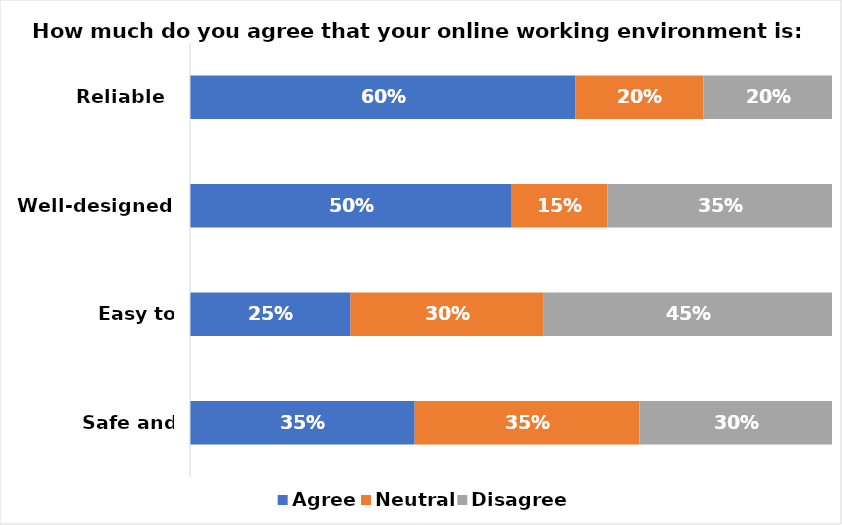
| Category | Agree | Neutral | Disagree |
|---|---|---|---|
| Reliable  | 0.6 | 0.2 | 0.2 |
| Well-designed | 0.5 | 0.15 | 0.35 |
| Easy to navigate | 0.25 | 0.3 | 0.45 |
| Safe and secure | 0.35 | 0.35 | 0.3 |